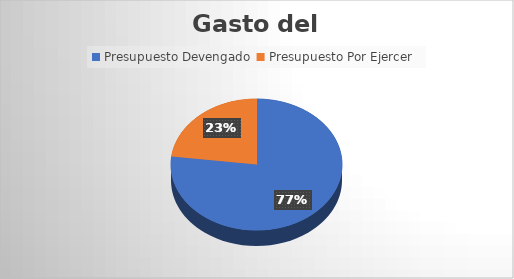
| Category | Monto  |
|---|---|
| Presupuesto Devengado  | 3078363.86 |
| Presupuesto Por Ejercer  | 921636.14 |